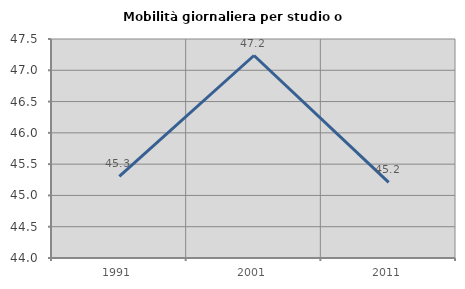
| Category | Mobilità giornaliera per studio o lavoro |
|---|---|
| 1991.0 | 45.303 |
| 2001.0 | 47.236 |
| 2011.0 | 45.208 |